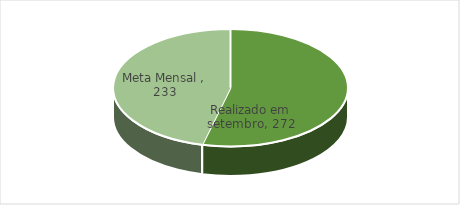
| Category | Series 0 |
|---|---|
| Realizado em setembro | 272 |
| Meta Mensal  | 233 |